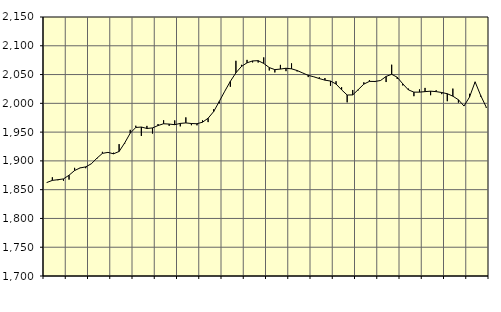
| Category | Piggar | Series 1 |
|---|---|---|
| nan | 1862.1 | 1862.42 |
| 1.0 | 1871.5 | 1866.12 |
| 1.0 | 1866.4 | 1867.33 |
| 1.0 | 1865.5 | 1868.67 |
| nan | 1867.5 | 1875.08 |
| 2.0 | 1887.9 | 1883.27 |
| 2.0 | 1888.2 | 1887.79 |
| 2.0 | 1887.3 | 1889.59 |
| nan | 1894.6 | 1894.94 |
| 3.0 | 1903.5 | 1904.54 |
| 3.0 | 1915.7 | 1913.06 |
| 3.0 | 1915.4 | 1914.78 |
| nan | 1914.2 | 1912.31 |
| 4.0 | 1929.1 | 1916.35 |
| 4.0 | 1930 | 1931.1 |
| 4.0 | 1953.9 | 1948.16 |
| nan | 1961.1 | 1958.06 |
| 5.0 | 1943.3 | 1958.8 |
| 5.0 | 1960.8 | 1956.31 |
| 5.0 | 1947.5 | 1957.27 |
| nan | 1964 | 1961.42 |
| 6.0 | 1970.6 | 1964.5 |
| 6.0 | 1960.9 | 1963.97 |
| 6.0 | 1970.3 | 1962.91 |
| nan | 1960 | 1965.12 |
| 7.0 | 1975.6 | 1965.96 |
| 7.0 | 1962 | 1964.94 |
| 7.0 | 1961.8 | 1964.55 |
| nan | 1970.4 | 1967.24 |
| 8.0 | 1967.4 | 1974.1 |
| 8.0 | 1989.7 | 1985.68 |
| 8.0 | 2000 | 2003.14 |
| nan | 2021 | 2021.08 |
| 9.0 | 2028.8 | 2038.2 |
| 9.0 | 2073.9 | 2053.06 |
| 9.0 | 2066.9 | 2064.12 |
| nan | 2075.5 | 2070.4 |
| 10.0 | 2071.1 | 2073.68 |
| 10.0 | 2070.9 | 2074.13 |
| 10.0 | 2079.8 | 2069.34 |
| nan | 2057.1 | 2062.11 |
| 11.0 | 2053.7 | 2058.58 |
| 11.0 | 2066.8 | 2059.53 |
| 11.0 | 2055.9 | 2060.95 |
| nan | 2069.4 | 2059.96 |
| 12.0 | 2055.4 | 2057.03 |
| 12.0 | 2052.9 | 2052.78 |
| 12.0 | 2045.6 | 2048.58 |
| nan | 2046 | 2046.13 |
| 13.0 | 2045.3 | 2043 |
| 13.0 | 2044 | 2040.29 |
| 13.0 | 2030.5 | 2038.73 |
| nan | 2038.4 | 2033.56 |
| 14.0 | 2028.1 | 2023.49 |
| 14.0 | 2001.7 | 2014.44 |
| 14.0 | 2023.2 | 2014.65 |
| nan | 2022.6 | 2023.9 |
| 15.0 | 2036.5 | 2033.39 |
| 15.0 | 2040.2 | 2038.14 |
| 15.0 | 2037 | 2038 |
| nan | 2039.9 | 2039.67 |
| 16.0 | 2037 | 2046.68 |
| 16.0 | 2067.1 | 2050.51 |
| 16.0 | 2042.3 | 2045.31 |
| nan | 2031.1 | 2033.85 |
| 17.0 | 2025.6 | 2023.5 |
| 17.0 | 2012.4 | 2019.44 |
| 17.0 | 2024.2 | 2019.47 |
| nan | 2026.8 | 2020.34 |
| 18.0 | 2014.1 | 2021.11 |
| 18.0 | 2022.7 | 2020.32 |
| 18.0 | 2016 | 2018.8 |
| nan | 2003.7 | 2016.68 |
| 19.0 | 2025.6 | 2012.45 |
| 19.0 | 2001.2 | 2006.2 |
| 19.0 | 1995.9 | 1995.29 |
| nan | 2016.6 | 2010.9 |
| 20.0 | 2036.5 | 2037.31 |
| 20.0 | 2011.7 | 2013.7 |
| 20.0 | 1992.2 | 1993.4 |